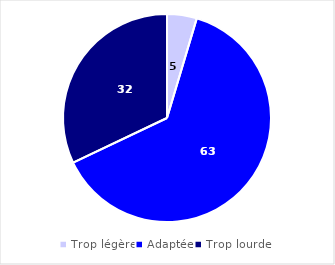
| Category | Series 0 |
|---|---|
| Trop légère | 4.62 |
| Adaptée | 63.31 |
| Trop lourde | 32.07 |